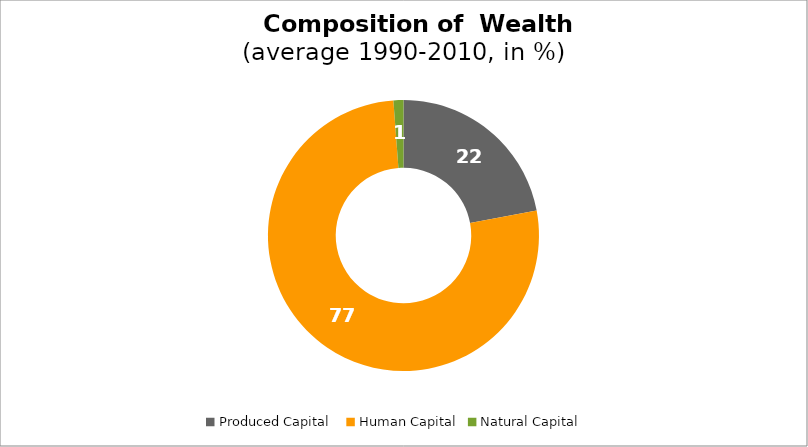
| Category | Series 0 |
|---|---|
| Produced Capital  | 22.038 |
| Human Capital | 76.773 |
| Natural Capital | 1.189 |